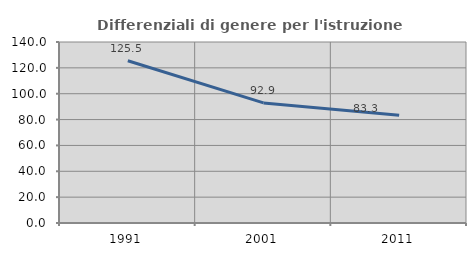
| Category | Differenziali di genere per l'istruzione superiore |
|---|---|
| 1991.0 | 125.502 |
| 2001.0 | 92.885 |
| 2011.0 | 83.294 |